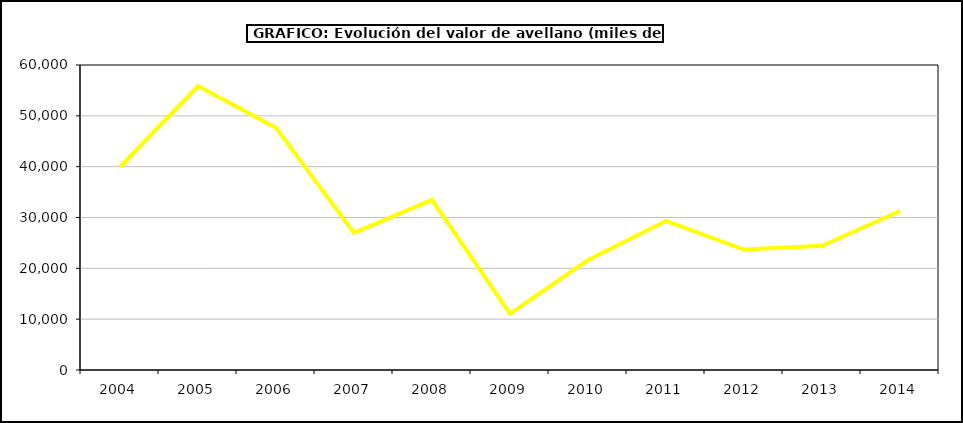
| Category | valor avellano |
|---|---|
| 2004.0 | 39980.781 |
| 2005.0 | 55868.107 |
| 2006.0 | 47640.162 |
| 2007.0 | 26974.435 |
| 2008.0 | 33473.214 |
| 2009.0 | 11073.069 |
| 2010.0 | 21658.97 |
| 2011.0 | 29345.397 |
| 2012.0 | 23700.751 |
| 2013.0 | 24448.005 |
| 2014.0 | 31273.096 |